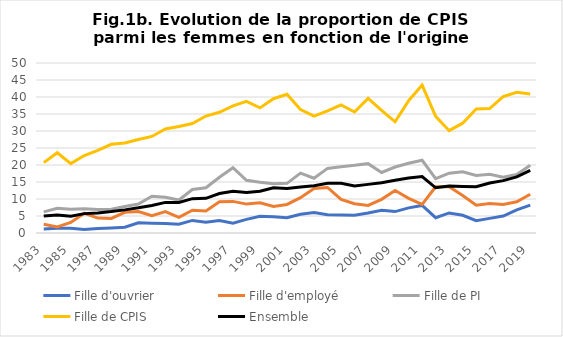
| Category | Fille d'ouvrier | Fille d'employé | Fille de PI | Fille de CPIS | Ensemble |
|---|---|---|---|---|---|
| 1983.0 | 1.2 | 2.6 | 6.2 | 20.7 | 5 |
| 1984.0 | 1.4 | 1.8 | 7.3 | 23.6 | 5.3 |
| 1985.0 | 1.4 | 3.1 | 7 | 20.4 | 4.9 |
| 1986.0 | 1 | 5.8 | 7.1 | 22.8 | 5.7 |
| 1987.0 | 1.3 | 4.4 | 6.9 | 24.3 | 5.9 |
| 1988.0 | 1.5 | 4.3 | 7 | 26.1 | 6.3 |
| 1989.0 | 1.7 | 6.1 | 7.8 | 26.5 | 6.8 |
| 1990.0 | 3 | 6.3 | 8.5 | 27.5 | 7.4 |
| 1991.0 | 2.9 | 5.1 | 10.8 | 28.4 | 8.1 |
| 1992.0 | 2.8 | 6.3 | 10.5 | 30.6 | 9 |
| 1993.0 | 2.6 | 4.6 | 9.7 | 31.3 | 9 |
| 1994.0 | 3.7 | 6.7 | 12.8 | 32.2 | 10.1 |
| 1995.0 | 3.2 | 6.5 | 13.3 | 34.4 | 10.2 |
| 1996.0 | 3.7 | 9.2 | 16.4 | 35.5 | 11.6 |
| 1997.0 | 2.9 | 9.3 | 19.2 | 37.4 | 12.3 |
| 1998.0 | 4 | 8.5 | 15.5 | 38.7 | 11.9 |
| 1999.0 | 4.9 | 8.9 | 14.9 | 36.8 | 12.3 |
| 2000.0 | 4.8 | 7.8 | 14.5 | 39.5 | 13.3 |
| 2001.0 | 4.5 | 8.4 | 14.6 | 40.8 | 13.1 |
| 2002.0 | 5.5 | 10.4 | 17.6 | 36.3 | 13.5 |
| 2003.0 | 6 | 13.1 | 16.1 | 34.4 | 13.9 |
| 2004.0 | 5.4 | 13.4 | 19 | 35.9 | 14.6 |
| 2005.0 | 5.3 | 9.9 | 19.5 | 37.7 | 14.6 |
| 2006.0 | 5.2 | 8.6 | 19.9 | 35.6 | 13.8 |
| 2007.0 | 5.9 | 8.1 | 20.4 | 39.6 | 14.3 |
| 2008.0 | 6.7 | 9.9 | 17.8 | 36.1 | 14.8 |
| 2009.0 | 6.3 | 12.5 | 19.4 | 32.7 | 15.5 |
| 2010.0 | 7.4 | 10.2 | 20.5 | 38.9 | 16.2 |
| 2011.0 | 8.1 | 8.4 | 21.4 | 43.5 | 16.6 |
| 2012.0 | 4.5 | 13.6 | 16 | 34.3 | 13.3 |
| 2013.0 | 5.9 | 13.6 | 17.6 | 30.1 | 13.8 |
| 2014.0 | 5.2 | 11 | 18 | 32.3 | 13.7 |
| 2015.0 | 3.6 | 8.2 | 16.9 | 36.5 | 13.6 |
| 2016.0 | 4.3 | 8.7 | 17.3 | 36.6 | 14.7 |
| 2017.0 | 5 | 8.4 | 16.4 | 40.1 | 15.4 |
| 2018.0 | 6.8 | 9.2 | 17.2 | 41.4 | 16.5 |
| 2019.0 | 8.2 | 11.4 | 19.9 | 40.9 | 18.4 |